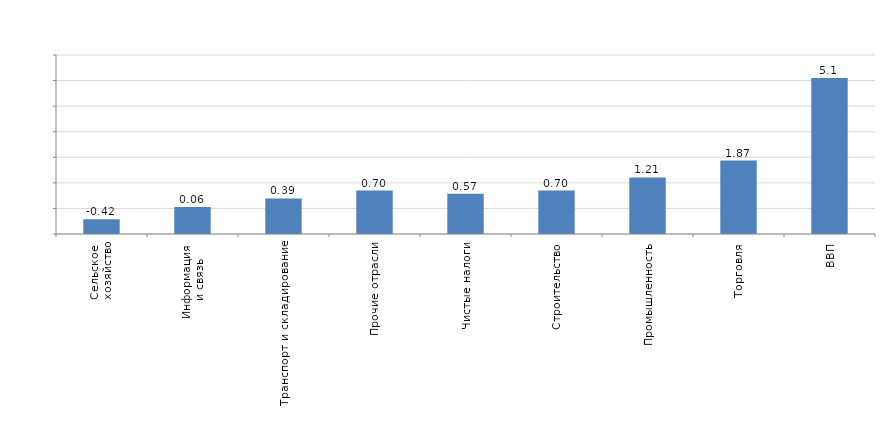
| Category | Series 0 |
|---|---|
| Сельское
 хозяйство | -0.42 |
| Информация
 и связь | 0.06 |
| Транспорт и складирование | 0.39 |
| Прочие отрасли | 0.7 |
| Чистые налоги | 0.57 |
| Строительство | 0.7 |
| Промышленность | 1.21 |
| Торговля | 1.87 |
| ВВП | 5.1 |